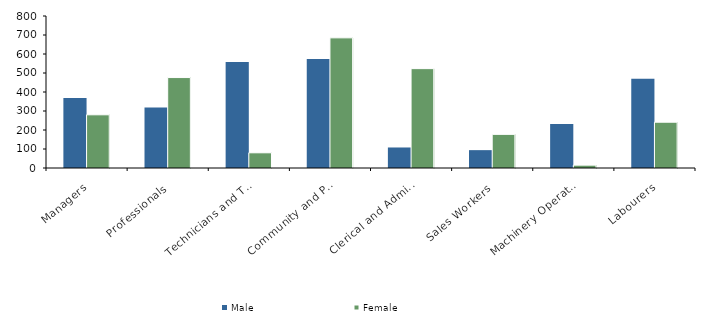
| Category | Male | Female |
|---|---|---|
| Managers | 369 | 280 |
| Professionals | 318 | 476 |
| Technicians and Trades Workers | 558 | 80 |
| Community and Personal Service Workers | 574 | 685 |
| Clerical and Administrative Workers | 108 | 523 |
| Sales Workers | 94 | 177 |
| Machinery Operators and Drivers | 232 | 15 |
| Labourers | 470 | 241 |